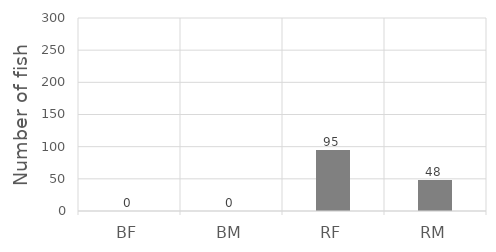
| Category | Series 0 |
|---|---|
| BF | 0 |
| BM | 0 |
| RF | 95 |
| RM | 48 |